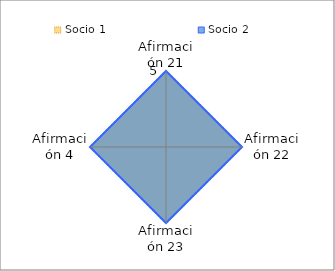
| Category | Socio 1 | Socio 2 |
|---|---|---|
| Afirmación 21 | 5 | 5 |
| Afirmación 22 | 5 | 5 |
| Afirmación 23 | 5 | 5 |
| Afirmación 4 | 5 | 5 |